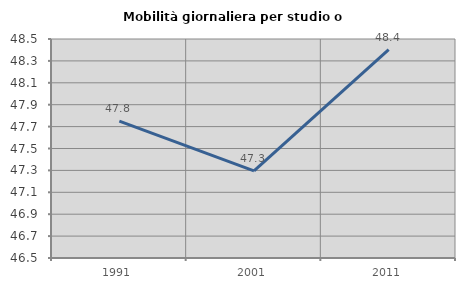
| Category | Mobilità giornaliera per studio o lavoro |
|---|---|
| 1991.0 | 47.75 |
| 2001.0 | 47.296 |
| 2011.0 | 48.404 |